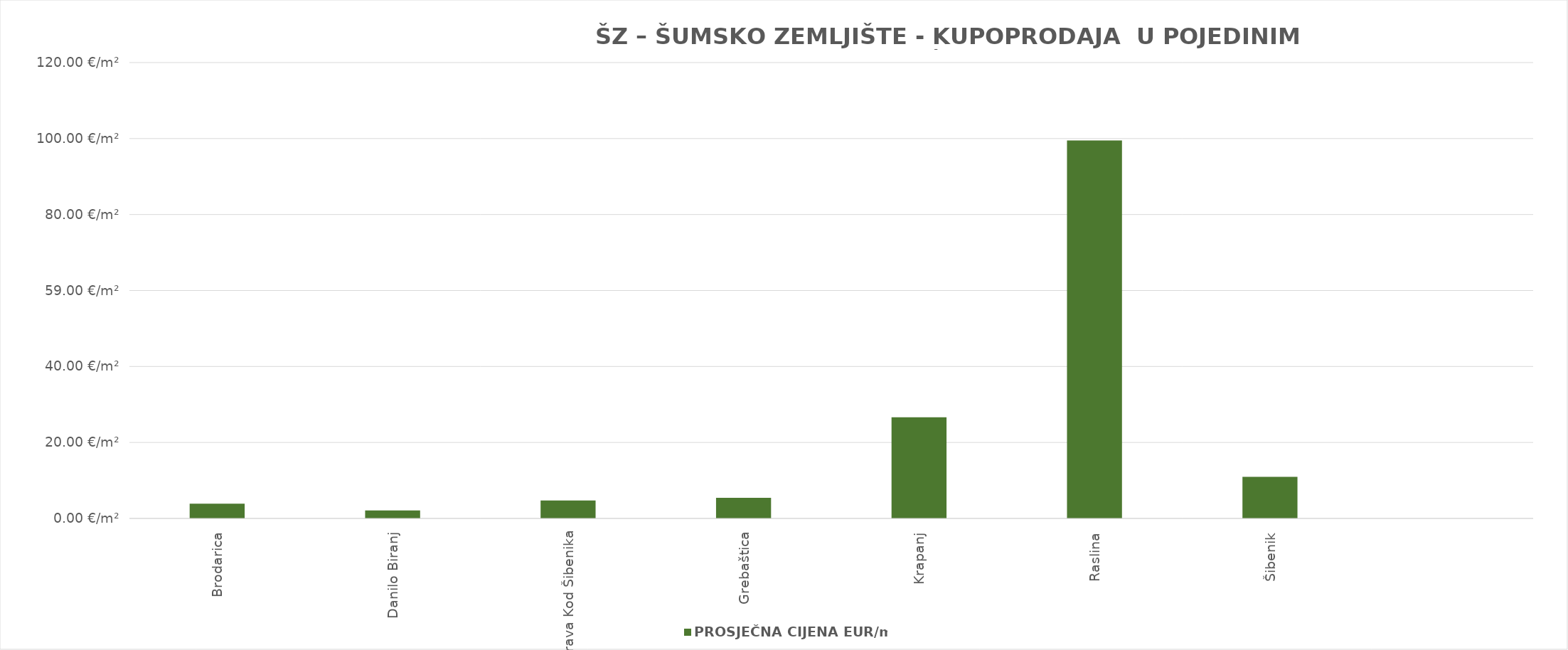
| Category | PROSJEČNA CIJENA EUR/m2 |
|---|---|
| Brodarica | 1900-01-03 21:25:08 |
| Danilo Biranj | 1900-01-02 02:27:12 |
| Dubrava Kod Šibenika | 1900-01-04 17:19:26 |
| Grebaštica | 1900-01-05 09:58:57 |
| Krapanj | 1900-01-26 15:25:57 |
| Raslina | 1900-04-08 11:39:07 |
| Šibenik | 1900-01-10 22:40:06 |